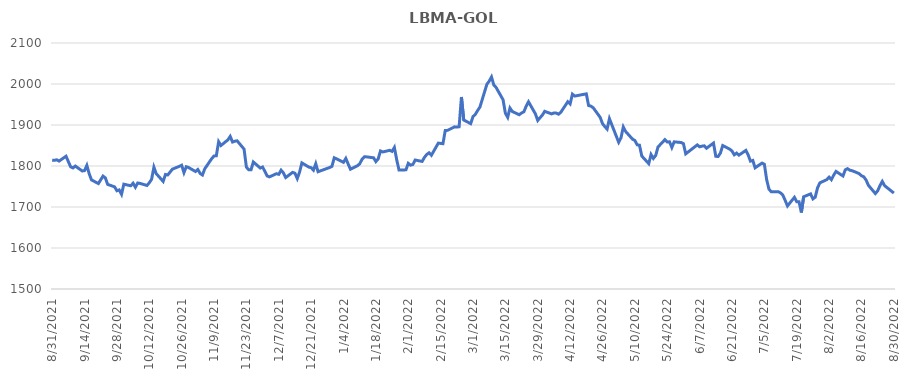
| Category | Series 0 |
|---|---|
| 8/31/21 | 1814.3 |
| 9/1/21 | 1813.9 |
| 9/2/21 | 1815.15 |
| 9/3/21 | 1812.05 |
| 9/6/21 | 1823.85 |
| 9/7/21 | 1810.75 |
| 9/8/21 | 1797.95 |
| 9/9/21 | 1795.35 |
| 9/10/21 | 1799.9 |
| 9/13/21 | 1787.85 |
| 9/14/21 | 1788.65 |
| 9/15/21 | 1801.4 |
| 9/16/21 | 1781.45 |
| 9/17/21 | 1766.1 |
| 9/20/21 | 1757.15 |
| 9/21/21 | 1766.45 |
| 9/22/21 | 1775.35 |
| 9/23/21 | 1771.05 |
| 9/24/21 | 1755.15 |
| 9/27/21 | 1749.15 |
| 9/28/21 | 1739.65 |
| 9/29/21 | 1741.65 |
| 9/30/21 | 1730.95 |
| 10/1/21 | 1755.6 |
| 10/4/21 | 1751.85 |
| 10/5/21 | 1758 |
| 10/6/21 | 1748.25 |
| 10/7/21 | 1758.55 |
| 10/8/21 | 1757.5 |
| 10/11/21 | 1752.55 |
| 10/12/21 | 1759.1 |
| 10/13/21 | 1767.45 |
| 10/14/21 | 1797.15 |
| 10/15/21 | 1781.45 |
| 10/18/21 | 1762.45 |
| 10/19/21 | 1779.4 |
| 10/20/21 | 1778.15 |
| 10/21/21 | 1785.3 |
| 10/22/21 | 1792.3 |
| 10/25/21 | 1799.2 |
| 10/26/21 | 1801.9 |
| 10/27/21 | 1783.85 |
| 10/28/21 | 1798.2 |
| 10/29/21 | 1796.3 |
| 11/1/21 | 1786.55 |
| 11/2/21 | 1791.5 |
| 11/3/21 | 1781.85 |
| 11/4/21 | 1778.1 |
| 11/5/21 | 1793.2 |
| 11/8/21 | 1818 |
| 11/9/21 | 1824.4 |
| 11/10/21 | 1824.95 |
| 11/11/21 | 1859.25 |
| 11/12/21 | 1850 |
| 11/15/21 | 1863.8 |
| 11/16/21 | 1872.25 |
| 11/17/21 | 1858.45 |
| 11/18/21 | 1860.5 |
| 11/19/21 | 1861.4 |
| 11/22/21 | 1841.1 |
| 11/23/21 | 1797.3 |
| 11/24/21 | 1790.8 |
| 11/25/21 | 1790.65 |
| 11/26/21 | 1809.8 |
| 11/29/21 | 1795 |
| 11/30/21 | 1797.6 |
| 12/1/21 | 1786.8 |
| 12/2/21 | 1775.7 |
| 12/3/21 | 1773.5 |
| 12/6/21 | 1781.25 |
| 12/7/21 | 1779.65 |
| 12/8/21 | 1789.8 |
| 12/9/21 | 1783.4 |
| 12/10/21 | 1771.9 |
| 12/13/21 | 1784.45 |
| 12/14/21 | 1782.35 |
| 12/15/21 | 1769.4 |
| 12/16/21 | 1785.15 |
| 12/17/21 | 1807.5 |
| 12/20/21 | 1797.4 |
| 12/21/21 | 1795.85 |
| 12/22/21 | 1789.9 |
| 12/23/21 | 1805.55 |
| 12/24/21 | 1786.05 |
| 12/29/21 | 1796.35 |
| 12/30/21 | 1799.25 |
| 12/31/21 | 1820.1 |
| 1/4/22 | 1809.05 |
| 1/5/22 | 1818.5 |
| 1/6/22 | 1804.95 |
| 1/7/22 | 1792.2 |
| 1/10/22 | 1800.55 |
| 1/11/22 | 1805.2 |
| 1/12/22 | 1816.4 |
| 1/13/22 | 1822.4 |
| 1/14/22 | 1822.25 |
| 1/17/22 | 1820.05 |
| 1/18/22 | 1810.8 |
| 1/19/22 | 1817.5 |
| 1/20/22 | 1836.7 |
| 1/21/22 | 1834.25 |
| 1/24/22 | 1838.25 |
| 1/25/22 | 1835.65 |
| 1/26/22 | 1845.2 |
| 1/27/22 | 1815.5 |
| 1/28/22 | 1790.2 |
| 1/31/22 | 1790.6 |
| 2/1/22 | 1806.5 |
| 2/2/22 | 1802 |
| 2/3/22 | 1803.75 |
| 2/4/22 | 1814.55 |
| 2/7/22 | 1811.15 |
| 2/8/22 | 1821 |
| 2/9/22 | 1828.1 |
| 2/10/22 | 1832.3 |
| 2/11/22 | 1826.25 |
| 2/14/22 | 1855.8 |
| 2/15/22 | 1855.1 |
| 2/16/22 | 1854.4 |
| 2/17/22 | 1886.55 |
| 2/18/22 | 1886.95 |
| 2/21/22 | 1895.45 |
| 2/22/22 | 1895 |
| 2/23/22 | 1895.7 |
| 2/24/22 | 1968.35 |
| 2/25/22 | 1912.15 |
| 2/28/22 | 1903.3 |
| 3/1/22 | 1920.45 |
| 3/2/22 | 1926 |
| 3/3/22 | 1935.4 |
| 3/4/22 | 1943.8 |
| 3/7/22 | 1999.25 |
| 3/8/22 | 2007 |
| 3/9/22 | 2017.15 |
| 3/10/22 | 1997.65 |
| 3/11/22 | 1991.45 |
| 3/14/22 | 1961.6 |
| 3/15/22 | 1928.75 |
| 3/16/22 | 1918.75 |
| 3/17/22 | 1941.4 |
| 3/18/22 | 1932.9 |
| 3/21/22 | 1925.05 |
| 3/22/22 | 1929.35 |
| 3/23/22 | 1932.15 |
| 3/24/22 | 1945.9 |
| 3/25/22 | 1956.65 |
| 3/28/22 | 1927 |
| 3/29/22 | 1911.05 |
| 3/30/22 | 1917.8 |
| 3/31/22 | 1924.1 |
| 4/1/22 | 1933.35 |
| 4/4/22 | 1927.1 |
| 4/5/22 | 1929.45 |
| 4/6/22 | 1929 |
| 4/7/22 | 1926.4 |
| 4/8/22 | 1931.2 |
| 4/11/22 | 1956.85 |
| 4/12/22 | 1951.4 |
| 4/13/22 | 1975.25 |
| 4/14/22 | 1970.6 |
| 4/19/22 | 1975.95 |
| 4/20/22 | 1947.55 |
| 4/21/22 | 1945.95 |
| 4/22/22 | 1942 |
| 4/25/22 | 1918.7 |
| 4/26/22 | 1903.4 |
| 4/27/22 | 1896.15 |
| 4/28/22 | 1890 |
| 4/29/22 | 1915.45 |
| 5/3/22 | 1857.9 |
| 5/4/22 | 1868.7 |
| 5/5/22 | 1895.2 |
| 5/6/22 | 1884.3 |
| 5/9/22 | 1865.4 |
| 5/10/22 | 1862.25 |
| 5/11/22 | 1851.75 |
| 5/12/22 | 1850.75 |
| 5/13/22 | 1824.2 |
| 5/16/22 | 1805.8 |
| 5/17/22 | 1828.05 |
| 5/18/22 | 1818.5 |
| 5/19/22 | 1825.55 |
| 5/20/22 | 1846.3 |
| 5/23/22 | 1864.3 |
| 5/24/22 | 1858.6 |
| 5/25/22 | 1859.05 |
| 5/26/22 | 1845.15 |
| 5/27/22 | 1858.95 |
| 5/30/22 | 1857.25 |
| 5/31/22 | 1854.4 |
| 6/1/22 | 1829.7 |
| 6/6/22 | 1851.5 |
| 6/7/22 | 1846.8 |
| 6/8/22 | 1848.35 |
| 6/9/22 | 1849.25 |
| 6/10/22 | 1843.35 |
| 6/13/22 | 1855.95 |
| 6/14/22 | 1823.65 |
| 6/15/22 | 1823.15 |
| 6/16/22 | 1831.55 |
| 6/17/22 | 1849.85 |
| 6/20/22 | 1841.2 |
| 6/21/22 | 1836.5 |
| 6/22/22 | 1827.3 |
| 6/23/22 | 1831.4 |
| 6/24/22 | 1826.5 |
| 6/27/22 | 1838.05 |
| 6/28/22 | 1827 |
| 6/29/22 | 1811.85 |
| 6/30/22 | 1813.6 |
| 7/1/22 | 1795.65 |
| 7/4/22 | 1807.05 |
| 7/5/22 | 1804.4 |
| 7/6/22 | 1766.65 |
| 7/7/22 | 1743.45 |
| 7/8/22 | 1737.05 |
| 7/11/22 | 1737.4 |
| 7/12/22 | 1734.35 |
| 7/13/22 | 1728.9 |
| 7/14/22 | 1716.15 |
| 7/15/22 | 1702.55 |
| 7/18/22 | 1723.65 |
| 7/19/22 | 1712.95 |
| 7/20/22 | 1712.65 |
| 7/21/22 | 1686.55 |
| 7/22/22 | 1725 |
| 7/25/22 | 1731.95 |
| 7/26/22 | 1719.85 |
| 7/27/22 | 1723.95 |
| 7/28/22 | 1746.6 |
| 7/29/22 | 1758.9 |
| 8/1/22 | 1766.75 |
| 8/2/22 | 1772.9 |
| 8/3/22 | 1766.6 |
| 8/4/22 | 1777.9 |
| 8/5/22 | 1786.75 |
| 8/8/22 | 1775.7 |
| 8/9/22 | 1790.6 |
| 8/10/22 | 1793.5 |
| 8/11/22 | 1789.7 |
| 8/12/22 | 1788.45 |
| 8/15/22 | 1781.45 |
| 8/16/22 | 1776.15 |
| 8/17/22 | 1773.65 |
| 8/18/22 | 1765.6 |
| 8/19/22 | 1752.9 |
| 8/22/22 | 1732.8 |
| 8/23/22 | 1739.45 |
| 8/24/22 | 1752 |
| 8/25/22 | 1762.4 |
| 8/26/22 | 1752.1 |
| 8/30/22 | 1734 |